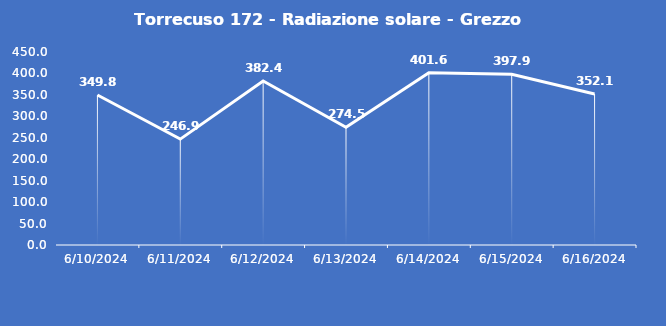
| Category | Torrecuso 172 - Radiazione solare - Grezzo (W/m2) |
|---|---|
| 6/10/24 | 349.8 |
| 6/11/24 | 246.9 |
| 6/12/24 | 382.4 |
| 6/13/24 | 274.5 |
| 6/14/24 | 401.6 |
| 6/15/24 | 397.9 |
| 6/16/24 | 352.1 |